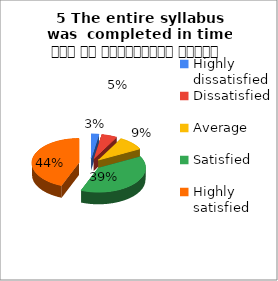
| Category | 5 The entire syllabus was  completed in time समय पर पाठ्यक्रम पूर्ण हुआ |
|---|---|
| Highly dissatisfied | 2 |
| Dissatisfied | 4 |
| Average | 7 |
| Satisfied | 29 |
| Highly satisfied | 33 |